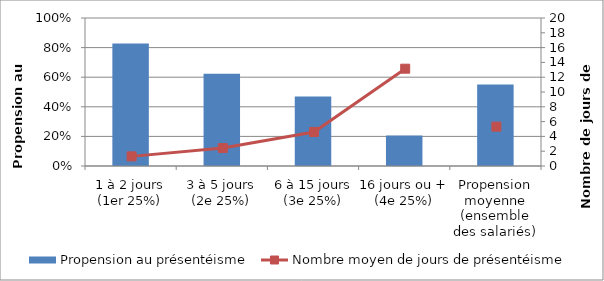
| Category | Propension au présentéisme |
|---|---|
| 1 à 2 jours (1er 25%) | 0.828 |
| 3 à 5 jours (2e 25%) | 0.624 |
| 6 à 15 jours (3e 25%) | 0.47 |
| 16 jours ou + (4e 25%) | 0.206 |
| Propension moyenne (ensemble des salariés) | 0.55 |